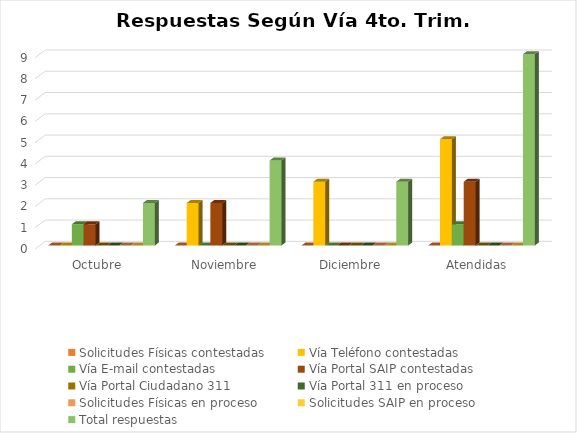
| Category | Solicitudes Físicas contestadas | Vía Teléfono contestadas | Vía E-mail contestadas | Vía Portal SAIP contestadas | Vía Portal Ciudadano 311  | Vía Portal 311 en proceso | Solicitudes Físicas en proceso | Solicitudes SAIP en proceso | Total respuestas  |
|---|---|---|---|---|---|---|---|---|---|
| Octubre | 0 | 0 | 1 | 1 | 0 | 0 | 0 | 0 | 2 |
| Noviembre | 0 | 2 | 0 | 2 | 0 | 0 | 0 | 0 | 4 |
| Diciembre | 0 | 3 | 0 | 0 | 0 | 0 | 0 | 0 | 3 |
| Atendidas | 0 | 5 | 1 | 3 | 0 | 0 | 0 | 0 | 9 |